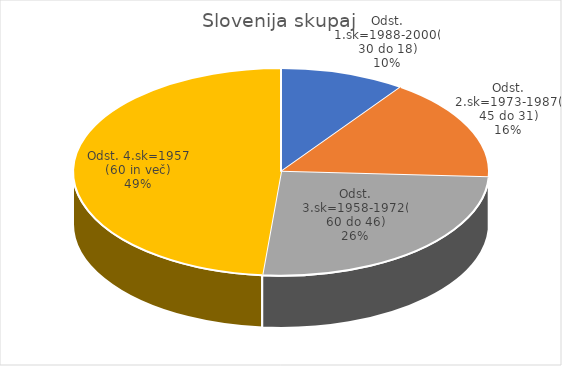
| Category | Slovenija skupaj |
|---|---|
| Odst. 1.sk=1988-2000(30 do 18) | 2.76 |
| Odst. 2.sk=1973-1987(45 do 31) | 4.53 |
| Odst. 3.sk=1958-1972(60 do 46) | 7.22 |
| Odst. 4.sk=1957 (60 in več) | 13.7 |